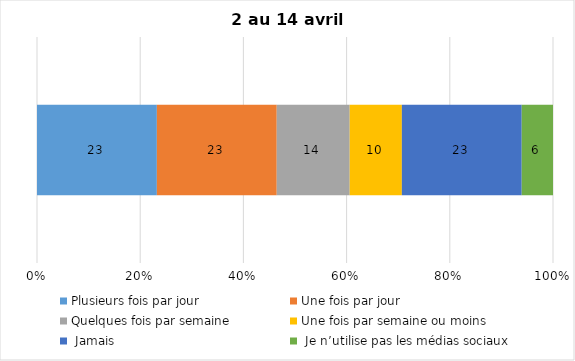
| Category | Plusieurs fois par jour | Une fois par jour | Quelques fois par semaine   | Une fois par semaine ou moins   |  Jamais   |  Je n’utilise pas les médias sociaux |
|---|---|---|---|---|---|---|
| 0 | 23 | 23 | 14 | 10 | 23 | 6 |